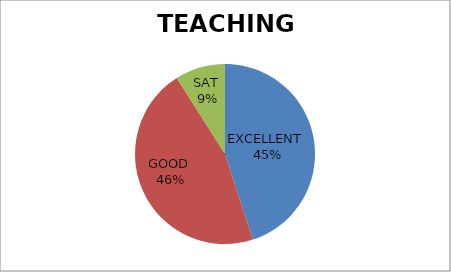
| Category | Series 0 |
|---|---|
| EXCELLENT  | 45 |
| GOOD  | 46 |
| SAT  | 9 |